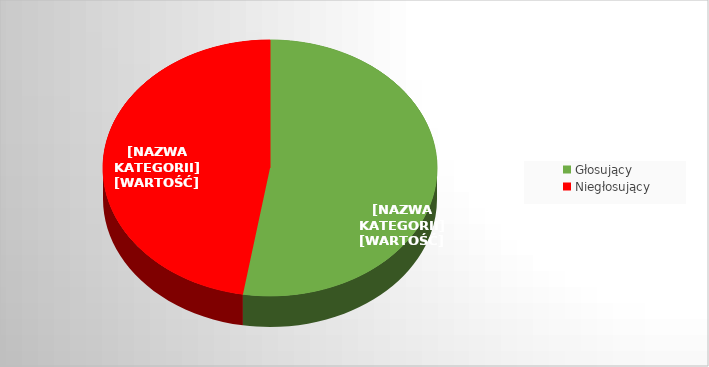
| Category | Series 0 |
|---|---|
| Głosujący | 0.526 |
| Niegłosujący | 0.474 |